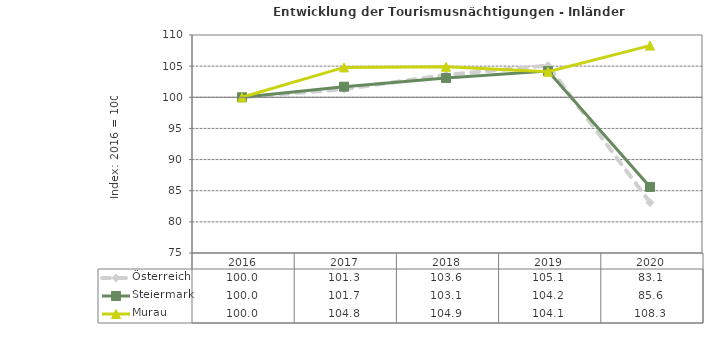
| Category | Österreich | Steiermark | Murau |
|---|---|---|---|
| 2020.0 | 83.1 | 85.6 | 108.3 |
| 2019.0 | 105.1 | 104.2 | 104.1 |
| 2018.0 | 103.6 | 103.1 | 104.9 |
| 2017.0 | 101.3 | 101.7 | 104.8 |
| 2016.0 | 100 | 100 | 100 |